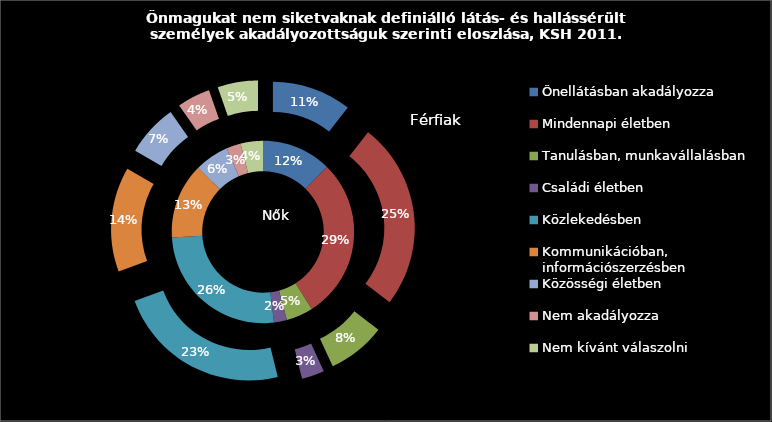
| Category | Nő | Férfi |
|---|---|---|
| 0 | 1978 | 907 |
| 1 | 4586 | 2135 |
| 2 | 762 | 664 |
| 3 | 367 | 259 |
| 4 | 4153 | 1994 |
| 5 | 2143 | 1197 |
| 6 | 970 | 595 |
| 7 | 410 | 378 |
| 8 | 633 | 460 |